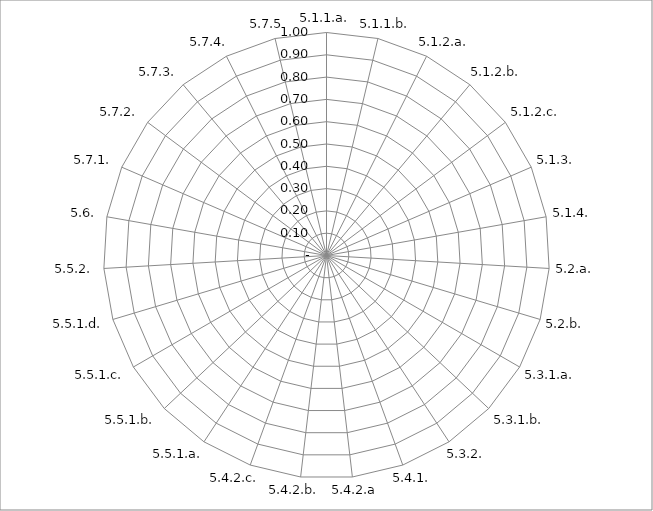
| Category | Series 0 |
|---|---|
| 5.1.1.a. | 0 |
| 5.1.1.b. | 0 |
| 5.1.2.a. | 0 |
| 5.1.2.b. | 0 |
| 5.1.2.c. | 0 |
| 5.1.3. | 0 |
| 5.1.4. | 0 |
| 5.2.a. | 0 |
| 5.2.b. | 0 |
| 5.3.1.a. | 0 |
| 5.3.1.b. | 0 |
| 5.3.2. | 0 |
| 5.4.1. | 0 |
| 5.4.2.a | 0 |
| 5.4.2.b. | 0 |
| 5.4.2.c. | 0 |
| 5.5.1.a. | 0 |
| 5.5.1.b. | 0 |
| 5.5.1.c. | 0 |
| 5.5.1.d. | 0 |
| 5.5.2. | 0 |
| 5.6. | 0 |
| 5.7.1. | 0 |
| 5.7.2. | 0 |
| 5.7.3. | 0 |
| 5.7.4. | 0 |
| 5.7.5 | 0 |